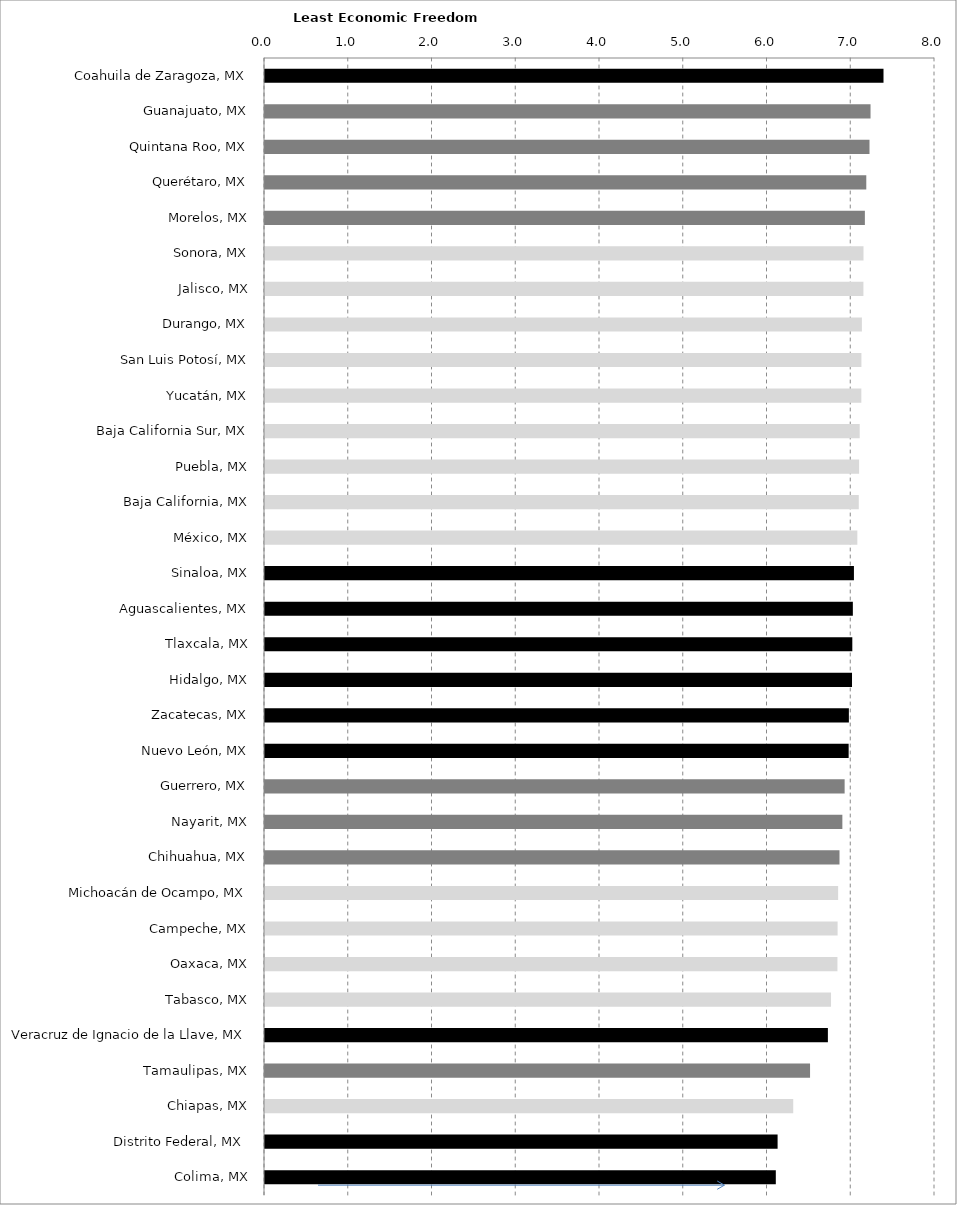
| Category | Series 0 |
|---|---|
| Coahuila de Zaragoza, MX | 7.385 |
| Guanajuato, MX | 7.23 |
| Quintana Roo, MX | 7.218 |
| Querétaro, MX | 7.18 |
| Morelos, MX | 7.163 |
| Sonora, MX | 7.146 |
| Jalisco, MX | 7.145 |
| Durango, MX | 7.127 |
| San Luis Potosí, MX | 7.121 |
| Yucatán, MX | 7.12 |
| Baja California Sur, MX | 7.101 |
| Puebla, MX | 7.094 |
| Baja California, MX | 7.09 |
| México, MX | 7.073 |
| Sinaloa, MX | 7.032 |
| Aguascalientes, MX | 7.019 |
| Tlaxcala, MX | 7.013 |
| Hidalgo, MX | 7.009 |
| Zacatecas, MX | 6.972 |
| Nuevo León, MX | 6.969 |
| Guerrero, MX | 6.921 |
| Nayarit, MX | 6.894 |
| Chihuahua, MX | 6.86 |
| Michoacán de Ocampo, MX | 6.843 |
| Campeche, MX | 6.837 |
| Oaxaca, MX | 6.835 |
| Tabasco, MX | 6.759 |
| Veracruz de Ignacio de la Llave, MX | 6.721 |
| Tamaulipas, MX | 6.508 |
| Chiapas, MX | 6.307 |
| Distrito Federal, MX  | 6.121 |
| Colima, MX | 6.099 |